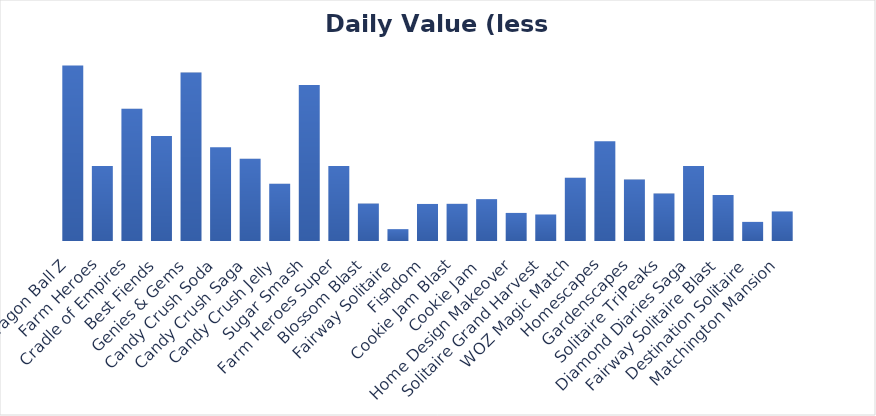
| Category | Daily Value (less W2E) |
|---|---|
| Dragon Ball Z | 9 |
| Farm Heroes | 3.84 |
| Cradle of Empires | 6.785 |
| Best Fiends | 5.39 |
| Genies & Gems | 8.64 |
| Candy Crush Soda | 4.809 |
| Candy Crush Saga | 4.213 |
| Candy Crush Jelly | 2.933 |
| Sugar Smash | 8 |
| Farm Heroes Super | 3.84 |
| Blossom Blast | 1.92 |
| ​​Fairway Solitaire | 0.608 |
| Fishdom | 1.9 |
| Cookie Jam Blast | 1.907 |
| Cookie Jam  | 2.147 |
| Home Design Makeover | 1.44 |
| Solitaire Grand Harvest | 1.36 |
| WOZ Magic Match | 3.247 |
| Homescapes | 5.12 |
| Gardenscapes | 3.153 |
| Solitaire TriPeaks | 2.434 |
| Diamond Diaries Saga | 3.84 |
| ​​Fairway Solitaire Blast | 2.359 |
| Destination Solitaire | 0.98 |
| Matchington Mansion | 1.517 |